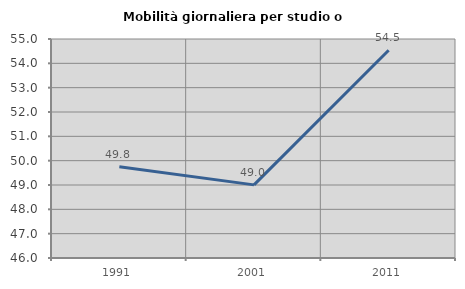
| Category | Mobilità giornaliera per studio o lavoro |
|---|---|
| 1991.0 | 49.753 |
| 2001.0 | 49.005 |
| 2011.0 | 54.536 |